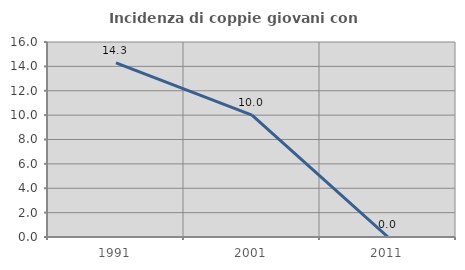
| Category | Incidenza di coppie giovani con figli |
|---|---|
| 1991.0 | 14.286 |
| 2001.0 | 10 |
| 2011.0 | 0 |